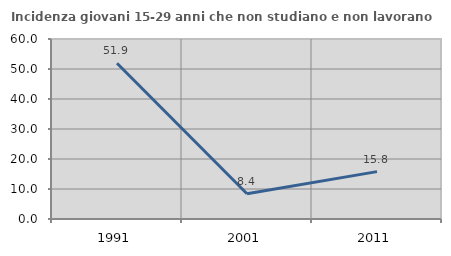
| Category | Incidenza giovani 15-29 anni che non studiano e non lavorano  |
|---|---|
| 1991.0 | 51.923 |
| 2001.0 | 8.407 |
| 2011.0 | 15.789 |